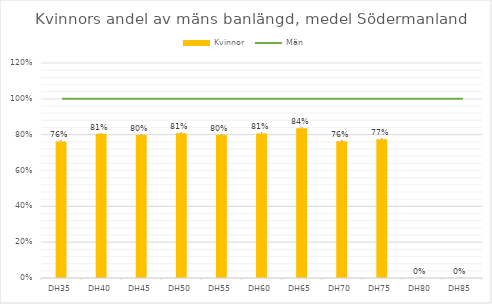
| Category | Kvinnor |
|---|---|
| DH35 | 0.763 |
| DH40 | 0.805 |
| DH45 | 0.798 |
| DH50 | 0.808 |
| DH55 | 0.8 |
| DH60 | 0.807 |
| DH65 | 0.836 |
| DH70 | 0.763 |
| DH75 | 0.774 |
| DH80 | 0 |
| DH85 | 0 |